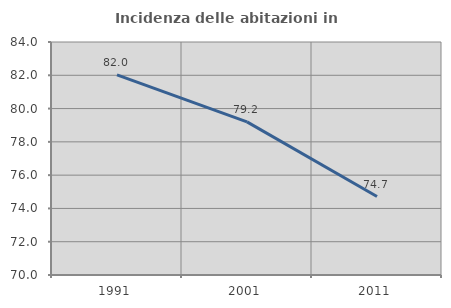
| Category | Incidenza delle abitazioni in proprietà  |
|---|---|
| 1991.0 | 82.02 |
| 2001.0 | 79.202 |
| 2011.0 | 74.715 |